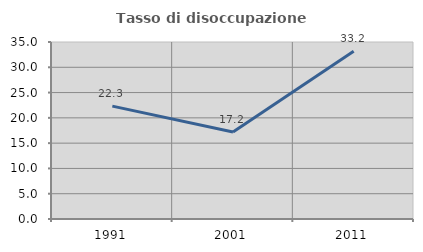
| Category | Tasso di disoccupazione giovanile  |
|---|---|
| 1991.0 | 22.316 |
| 2001.0 | 17.188 |
| 2011.0 | 33.166 |